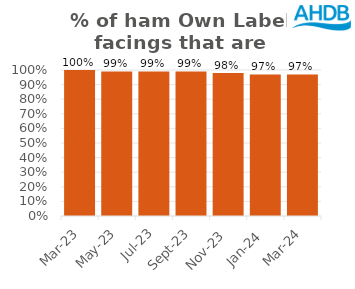
| Category | Ham |
|---|---|
| 2023-03-01 | 1 |
| 2023-05-01 | 0.99 |
| 2023-07-01 | 0.99 |
| 2023-09-01 | 0.99 |
| 2023-11-01 | 0.98 |
| 2024-01-01 | 0.97 |
| 2024-03-01 | 0.97 |